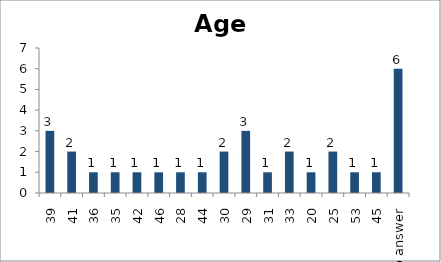
| Category | Age |
|---|---|
| 39 | 3 |
| 41 | 2 |
| 36 | 1 |
| 35 | 1 |
| 42 | 1 |
| 46 | 1 |
| 28 | 1 |
| 44 | 1 |
| 30 | 2 |
| 29 | 3 |
| 31 | 1 |
| 33 | 2 |
| 20 | 1 |
| 25 | 2 |
| 53 | 1 |
| 45 | 1 |
| No answer | 6 |